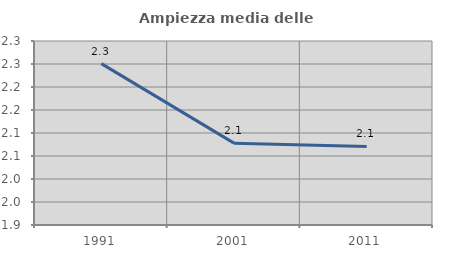
| Category | Ampiezza media delle famiglie |
|---|---|
| 1991.0 | 2.251 |
| 2001.0 | 2.078 |
| 2011.0 | 2.071 |